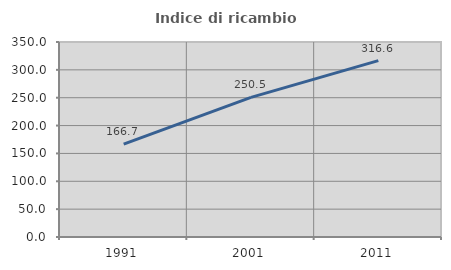
| Category | Indice di ricambio occupazionale  |
|---|---|
| 1991.0 | 166.709 |
| 2001.0 | 250.544 |
| 2011.0 | 316.623 |